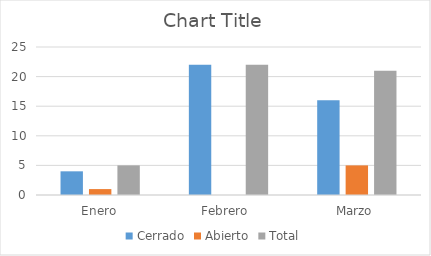
| Category | Cerrado | Abierto | Total |
|---|---|---|---|
| Enero | 4 | 1 | 5 |
| Febrero  | 22 | 0 | 22 |
| Marzo | 16 | 5 | 21 |